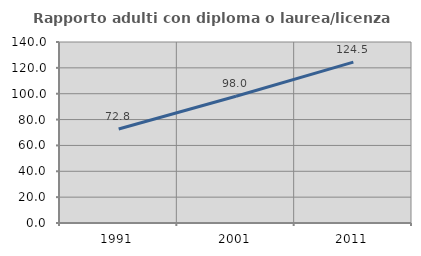
| Category | Rapporto adulti con diploma o laurea/licenza media  |
|---|---|
| 1991.0 | 72.759 |
| 2001.0 | 98.039 |
| 2011.0 | 124.471 |